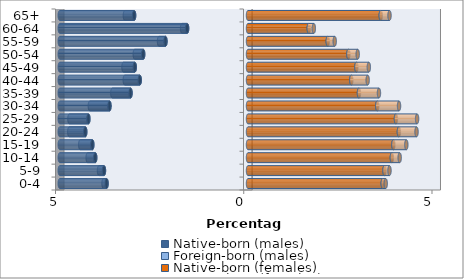
| Category | Native-born (males) | Foreign-born (males) | Native-born (females) | Foreign-born (females) |
|---|---|---|---|---|
| 0-4 | -3.756 | -0.081 | 3.579 | 0.079 |
| 5-9 | -3.826 | -0.132 | 3.625 | 0.133 |
| 10-14 | -4.058 | -0.201 | 3.821 | 0.208 |
| 15-19 | -4.135 | -0.321 | 3.861 | 0.345 |
| 20-24 | -4.322 | -0.425 | 4.008 | 0.469 |
| 25-29 | -4.24 | -0.503 | 3.929 | 0.562 |
| 30-34 | -3.68 | -0.521 | 3.433 | 0.579 |
| 35-39 | -3.12 | -0.484 | 2.947 | 0.531 |
| 40-44 | -2.875 | -0.398 | 2.745 | 0.434 |
| 45-49 | -3.008 | -0.3 | 2.879 | 0.331 |
| 50-54 | -2.784 | -0.224 | 2.666 | 0.248 |
| 55-59 | -2.192 | -0.171 | 2.118 | 0.185 |
| 60-64 | -1.617 | -0.133 | 1.614 | 0.135 |
| 65+ | -3.025 | -0.245 | 3.527 | 0.232 |